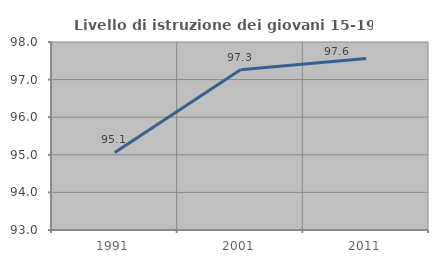
| Category | Livello di istruzione dei giovani 15-19 anni |
|---|---|
| 1991.0 | 95.062 |
| 2001.0 | 97.26 |
| 2011.0 | 97.561 |